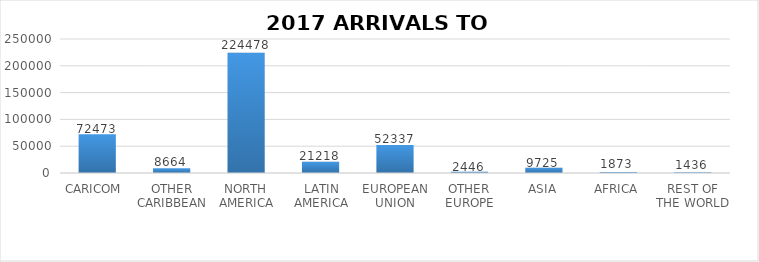
| Category | Series 0 |
|---|---|
| CARICOM  | 72473 |
| OTHER CARIBBEAN | 8664 |
| NORTH AMERICA | 224478 |
| LATIN AMERICA | 21218 |
| EUROPEAN UNION | 52337 |
| OTHER EUROPE | 2446 |
| ASIA | 9725 |
| AFRICA | 1873 |
| REST OF THE WORLD | 1436 |